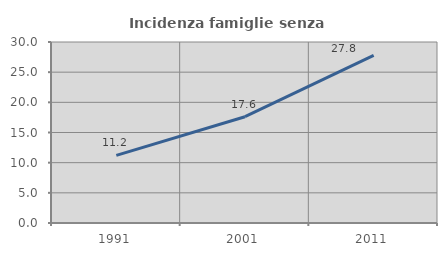
| Category | Incidenza famiglie senza nuclei |
|---|---|
| 1991.0 | 11.199 |
| 2001.0 | 17.615 |
| 2011.0 | 27.774 |